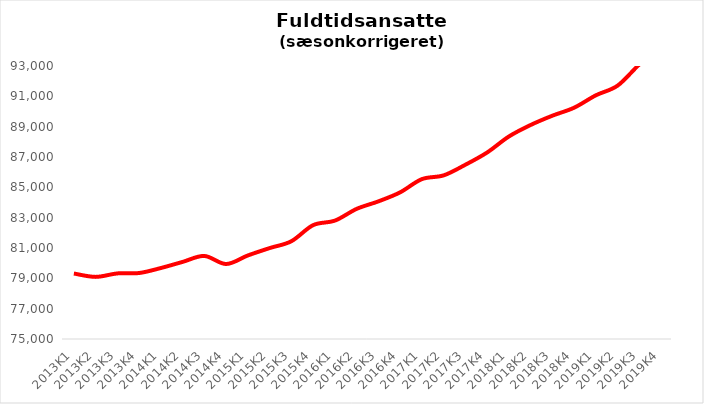
| Category | It-branchen i alt |
|---|---|
| 2013K1 | 79318.115 |
| 2013K2 | 79095.126 |
| 2013K3 | 79324.938 |
| 2013K4 | 79350.369 |
| 2014K1 | 79680.009 |
| 2014K2 | 80083.727 |
| 2014K3 | 80475.727 |
| 2014K4 | 79943.82 |
| 2015K1 | 80509.528 |
| 2015K2 | 80994.285 |
| 2015K3 | 81446.37 |
| 2015K4 | 82507.64 |
| 2016K1 | 82804.533 |
| 2016K2 | 83578.846 |
| 2016K3 | 84073.53 |
| 2016K4 | 84669.245 |
| 2017K1 | 85539.982 |
| 2017K2 | 85787.94 |
| 2017K3 | 86489.608 |
| 2017K4 | 87296.996 |
| 2018K1 | 88351.59 |
| 2018K2 | 89110.54 |
| 2018K3 | 89723.823 |
| 2018K4 | 90250.404 |
| 2019K1 | 91067.965 |
| 2019K2 | 91707.259 |
| 2019K3 | 93106.829 |
| 2019K4 | 94297.912 |